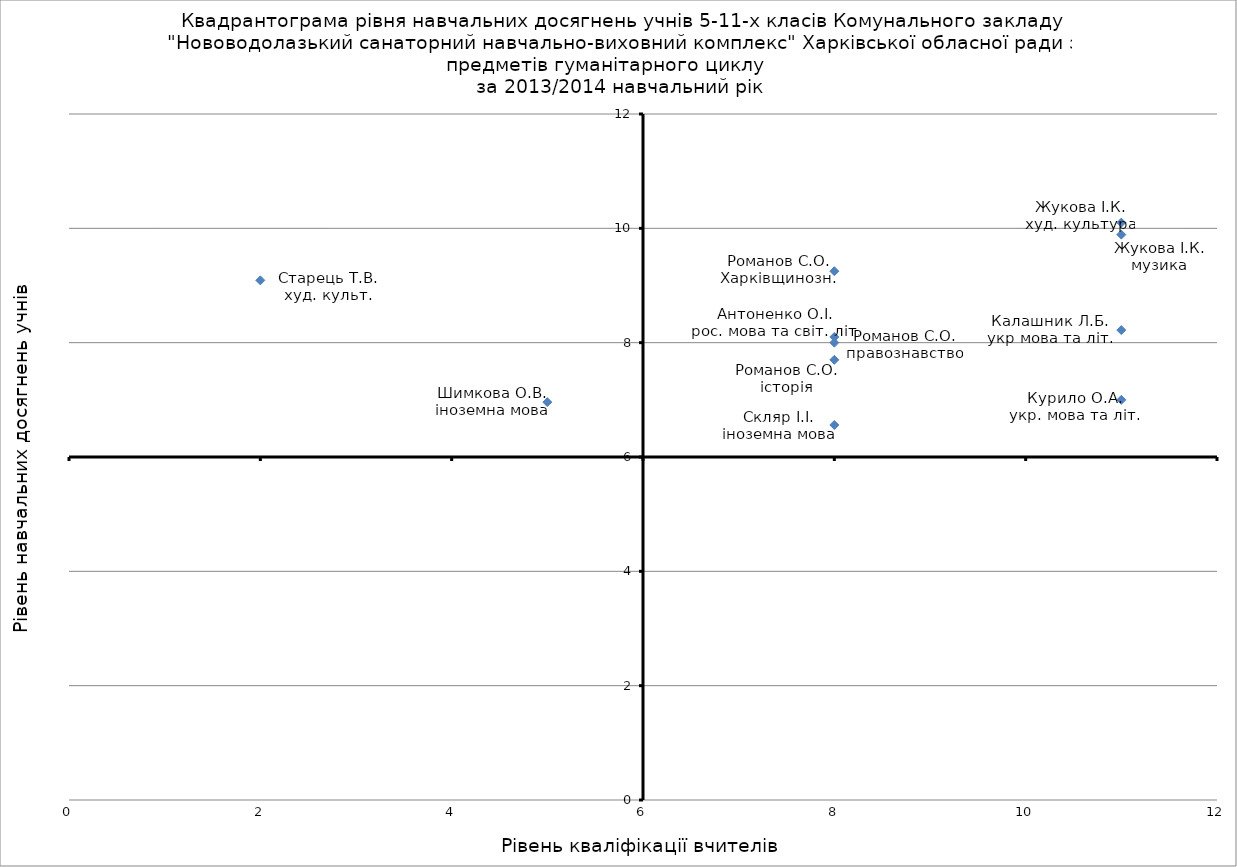
| Category | Series 0 |
|---|---|
| 11.0 | 8.22 |
| 11.0 | 7 |
| 8.0 | 7.7 |
| 8.0 | 6.56 |
| 11.0 | 9.89 |
| 5.0 | 6.96 |
| 8.0 | 8.1 |
| 8.0 | 8 |
| 8.0 | 9.25 |
| 2.0 | 9.09 |
| 11.0 | 10.1 |